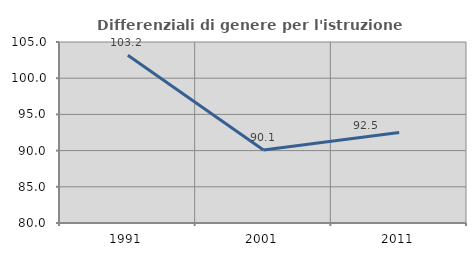
| Category | Differenziali di genere per l'istruzione superiore |
|---|---|
| 1991.0 | 103.182 |
| 2001.0 | 90.077 |
| 2011.0 | 92.492 |